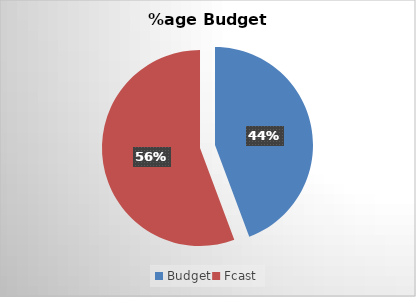
| Category | Series 0 |
|---|---|
| Budget | 1107.814 |
| Fcast | 1392.186 |